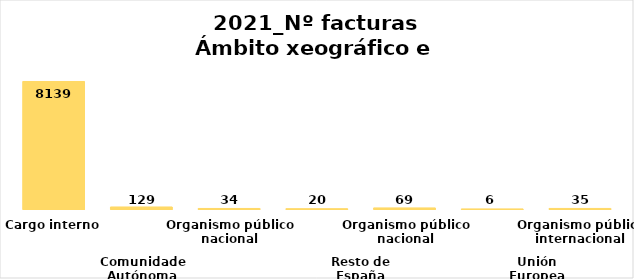
| Category | Series 0 |
|---|---|
| 0 | 8139 |
| 1 | 129 |
| 2 | 34 |
| 3 | 20 |
| 4 | 69 |
| 5 | 6 |
| 6 | 35 |